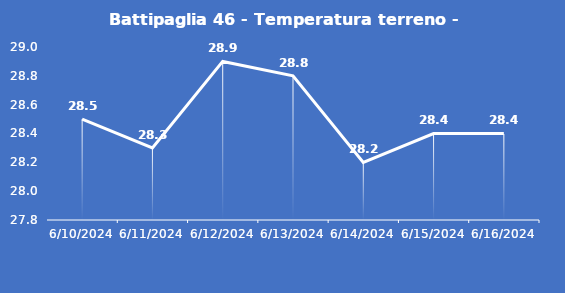
| Category | Battipaglia 46 - Temperatura terreno - Max (°C) |
|---|---|
| 6/10/24 | 28.5 |
| 6/11/24 | 28.3 |
| 6/12/24 | 28.9 |
| 6/13/24 | 28.8 |
| 6/14/24 | 28.2 |
| 6/15/24 | 28.4 |
| 6/16/24 | 28.4 |